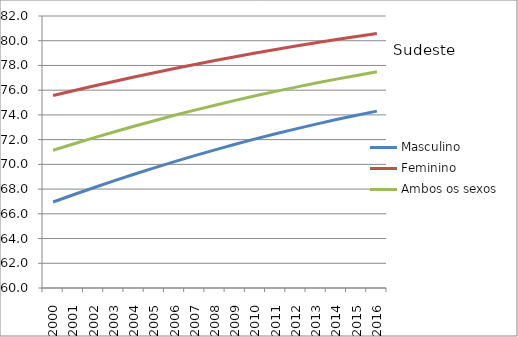
| Category | Masculino | Feminino | Ambos os sexos |
|---|---|---|---|
| 2000.0 | 66.959 | 75.567 | 71.143 |
| 2001.0 | 67.541 | 75.959 | 71.65 |
| 2002.0 | 68.108 | 76.336 | 72.141 |
| 2003.0 | 68.661 | 76.707 | 72.62 |
| 2004.0 | 69.201 | 77.068 | 73.085 |
| 2005.0 | 69.719 | 77.417 | 73.533 |
| 2006.0 | 70.224 | 77.757 | 73.968 |
| 2007.0 | 70.707 | 78.084 | 74.384 |
| 2008.0 | 71.176 | 78.398 | 74.785 |
| 2009.0 | 71.626 | 78.707 | 75.172 |
| 2010.0 | 72.058 | 79.005 | 75.545 |
| 2011.0 | 72.475 | 79.289 | 75.902 |
| 2012.0 | 72.873 | 79.569 | 76.247 |
| 2013.0 | 73.253 | 79.839 | 76.577 |
| 2014.0 | 73.622 | 80.096 | 76.894 |
| 2015.0 | 73.969 | 80.344 | 77.195 |
| 2016.0 | 74.304 | 80.586 | 77.486 |